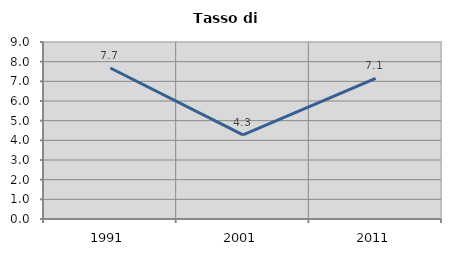
| Category | Tasso di disoccupazione   |
|---|---|
| 1991.0 | 7.678 |
| 2001.0 | 4.274 |
| 2011.0 | 7.15 |